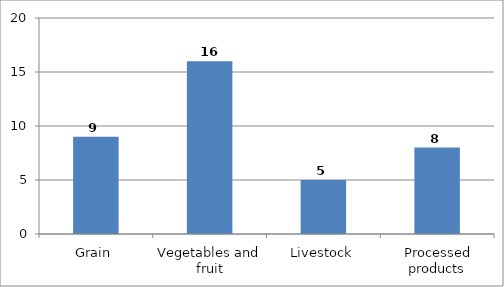
| Category | Series 0 |
|---|---|
| Grain | 9 |
| Vegetables and fruit | 16 |
| Livestock | 5 |
| Processed products | 8 |